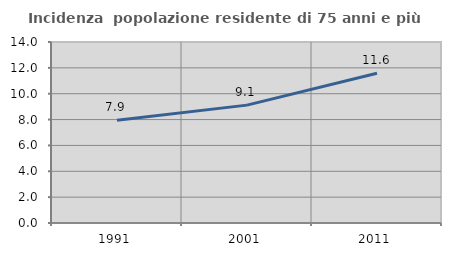
| Category | Incidenza  popolazione residente di 75 anni e più |
|---|---|
| 1991.0 | 7.942 |
| 2001.0 | 9.118 |
| 2011.0 | 11.585 |